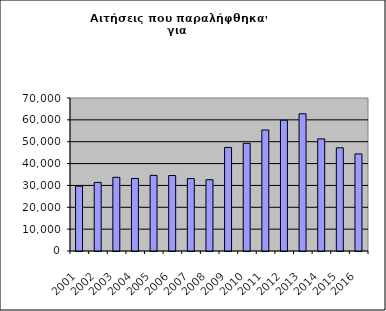
| Category | Series 1 |
|---|---|
| 2001.0 | 29694 |
| 2002.0 | 31386 |
| 2003.0 | 33712 |
| 2004.0 | 33179 |
| 2005.0 | 34612 |
| 2006.0 | 34527 |
| 2007.0 | 33131 |
| 2008.0 | 32607 |
| 2009.0 | 47377 |
| 2010.0 | 49282 |
| 2011.0 | 55358 |
| 2012.0 | 59832 |
| 2013.0 | 62771 |
| 2014.0 | 51290 |
| 2015.0 | 47204 |
| 2016.0 | 44413 |